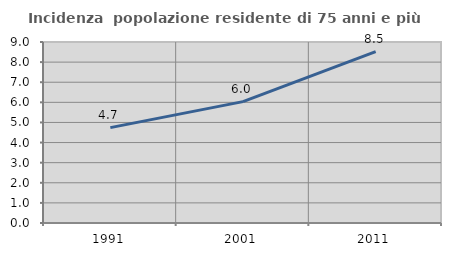
| Category | Incidenza  popolazione residente di 75 anni e più |
|---|---|
| 1991.0 | 4.742 |
| 2001.0 | 6.036 |
| 2011.0 | 8.523 |